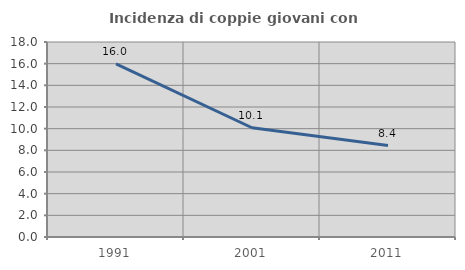
| Category | Incidenza di coppie giovani con figli |
|---|---|
| 1991.0 | 15.972 |
| 2001.0 | 10.086 |
| 2011.0 | 8.44 |